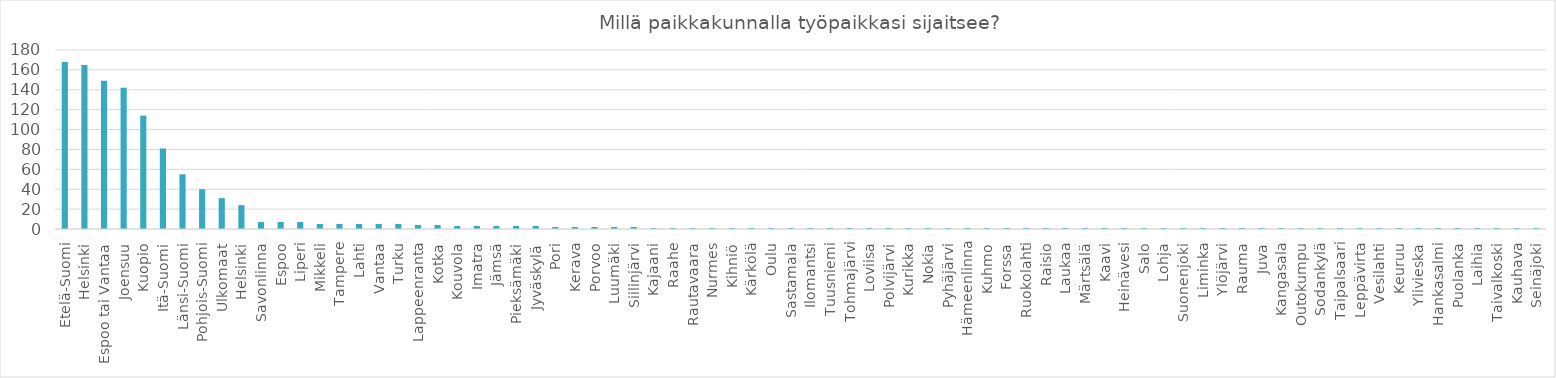
| Category | Summa |
|---|---|
| Etelä-Suomi | 168 |
| Helsinki, Espoo tai Vantaa | 165 |
| Joensuu | 149 |
| Kuopio | 142 |
| Itä-Suomi | 114 |
| Länsi-Suomi | 81 |
| Pohjois-Suomi | 55 |
| Ulkomaat | 40 |
| Helsinki | 31 |
| Savonlinna | 24 |
| Espoo | 7 |
| Liperi | 7 |
| Mikkeli | 7 |
| Tampere | 5 |
| Lahti | 5 |
| Vantaa | 5 |
| Turku | 5 |
| Lappeenranta | 5 |
| Kotka | 4 |
| Kouvola | 4 |
| Imatra | 3 |
| Jämsä | 3 |
| Pieksämäki | 3 |
| Jyväskylä | 3 |
| Pori | 3 |
| Kerava | 2 |
| Porvoo | 2 |
| Luumäki | 2 |
| Siilinjärvi | 2 |
| Kajaani | 2 |
| Raahe | 1 |
| Rautavaara | 1 |
| Nurmes | 1 |
| Kihniö | 1 |
| Kärkölä | 1 |
| Oulu | 1 |
| Sastamala | 1 |
| Ilomantsi | 1 |
| Tuusniemi | 1 |
| Tohmajärvi | 1 |
| Loviisa | 1 |
| Polvijärvi | 1 |
| Kurikka | 1 |
| Nokia | 1 |
| Pyhäjärvi | 1 |
| Hämeenlinna | 1 |
| Kuhmo | 1 |
| Forssa | 1 |
| Ruokolahti | 1 |
| Raisio | 1 |
| Laukaa | 1 |
| Märtsälä | 1 |
| Kaavi | 1 |
| Heinävesi | 1 |
| Salo | 1 |
| Lohja | 1 |
| Suonenjoki | 1 |
| Liminka | 1 |
| Ylöjärvi | 1 |
| Rauma | 1 |
| Juva | 1 |
| Kangasala | 1 |
| Outokumpu | 1 |
| Sodankylä | 1 |
| Taipalsaari | 1 |
| Leppävirta | 1 |
| Vesilahti | 1 |
| Keuruu | 1 |
| Ylivieska | 1 |
| Hankasalmi | 1 |
| Puolanka | 1 |
| Laihia | 1 |
| Taivalkoski | 1 |
| Kauhava | 1 |
| Seinäjoki | 1 |
| Hamina | 1 |